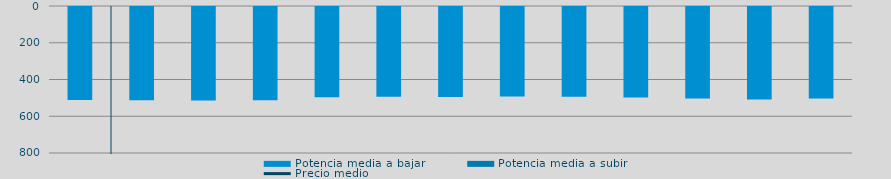
| Category | Potencia media a bajar | Potencia media a subir |
|---|---|---|
| 0 | 505.54 |  |
| 1 | 508.149 |  |
| 2 | 509.307 |  |
| 3 | 507.622 |  |
| 4 | 491.087 |  |
| 5 | 488.923 |  |
| 6 | 489.119 |  |
| 7 | 487.546 |  |
| 8 | 488.653 |  |
| 9 | 492.01 |  |
| 10 | 498.529 |  |
| 11 | 503.264 |  |
| 12 | 498.488 |  |